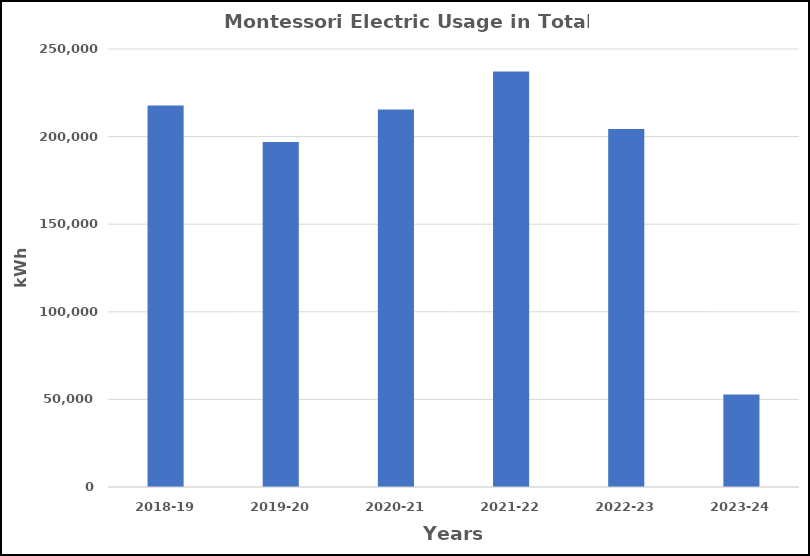
| Category | Series 0 |
|---|---|
| 2018-19 | 217723 |
| 2019-20 | 196979 |
| 2020-21 | 215528 |
| 2021-22 | 237218 |
| 2022-23 | 204390 |
| 2023-24 | 52744 |